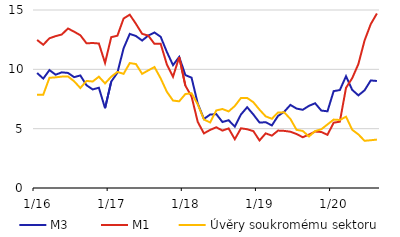
| Category | M3  | M1 | Úvěry soukromému sektoru |
|---|---|---|---|
|  1/16 | 9.691 | 12.477 | 7.853 |
| 2 | 9.221 | 12.071 | 7.865 |
| 3 | 9.937 | 12.619 | 9.286 |
| 4 | 9.548 | 12.796 | 9.325 |
| 5 | 9.747 | 12.937 | 9.385 |
| 6 | 9.696 | 13.442 | 9.403 |
| 7 | 9.341 | 13.169 | 8.992 |
| 8 | 9.484 | 12.872 | 8.426 |
| 9 | 8.659 | 12.193 | 9.022 |
| 10 | 8.307 | 12.218 | 8.975 |
| 11 | 8.449 | 12.177 | 9.38 |
| 12 | 6.723 | 10.54 | 8.816 |
|  1/17 | 8.966 | 12.711 | 9.379 |
| 2 | 9.714 | 12.834 | 9.781 |
| 3 | 11.775 | 14.282 | 9.62 |
| 4 | 12.987 | 14.606 | 10.528 |
| 5 | 12.808 | 13.83 | 10.445 |
| 6 | 12.425 | 12.993 | 9.619 |
| 7 | 12.849 | 12.842 | 9.914 |
| 8 | 13.105 | 12.147 | 10.193 |
| 9 | 12.743 | 12.148 | 9.238 |
| 10 | 11.473 | 10.419 | 8.113 |
| 11 | 10.355 | 9.377 | 7.368 |
| 12 | 11.047 | 11.032 | 7.305 |
|  1/18 | 9.516 | 8.626 | 7.918 |
| 2 | 9.298 | 7.714 | 7.983 |
| 3 | 7.121 | 5.573 | 7.051 |
| 4 | 5.819 | 4.602 | 5.78 |
| 5 | 6.185 | 4.894 | 5.522 |
| 6 | 6.228 | 5.118 | 6.536 |
| 7 | 5.561 | 4.84 | 6.657 |
| 8 | 5.712 | 5.02 | 6.454 |
| 9 | 5.172 | 4.113 | 6.908 |
| 10 | 6.2 | 5.031 | 7.59 |
| 11 | 6.807 | 4.95 | 7.588 |
| 12 | 6.195 | 4.794 | 7.229 |
|  1/19 | 5.516 | 4.009 | 6.6 |
| 2 | 5.54 | 4.604 | 6.035 |
| 3 | 5.275 | 4.413 | 5.835 |
| 4 | 6.075 | 4.839 | 6.369 |
| 5 | 6.427 | 4.813 | 6.374 |
| 6 | 7.002 | 4.742 | 5.815 |
| 7 | 6.692 | 4.549 | 4.899 |
| 8 | 6.591 | 4.278 | 4.808 |
| 9 | 6.924 | 4.5 | 4.343 |
| 10 | 7.14 | 4.758 | 4.797 |
| 11 | 6.526 | 4.72 | 4.948 |
| 12 | 6.463 | 4.481 | 5.357 |
|  1/20 | 8.164 | 5.503 | 5.765 |
| 2 | 8.253 | 5.59 | 5.73 |
| 3 | 9.419 | 8.44 | 6.009 |
| 4 | 8.269 | 9.253 | 4.908 |
| 5 | 7.806 | 10.444 | 4.516 |
| 6 | 8.229 | 12.427 | 3.978 |
| 7 | 9.064 | 13.806 | 4.025 |
| 8 | 9.018 | 14.706 | 4.081 |